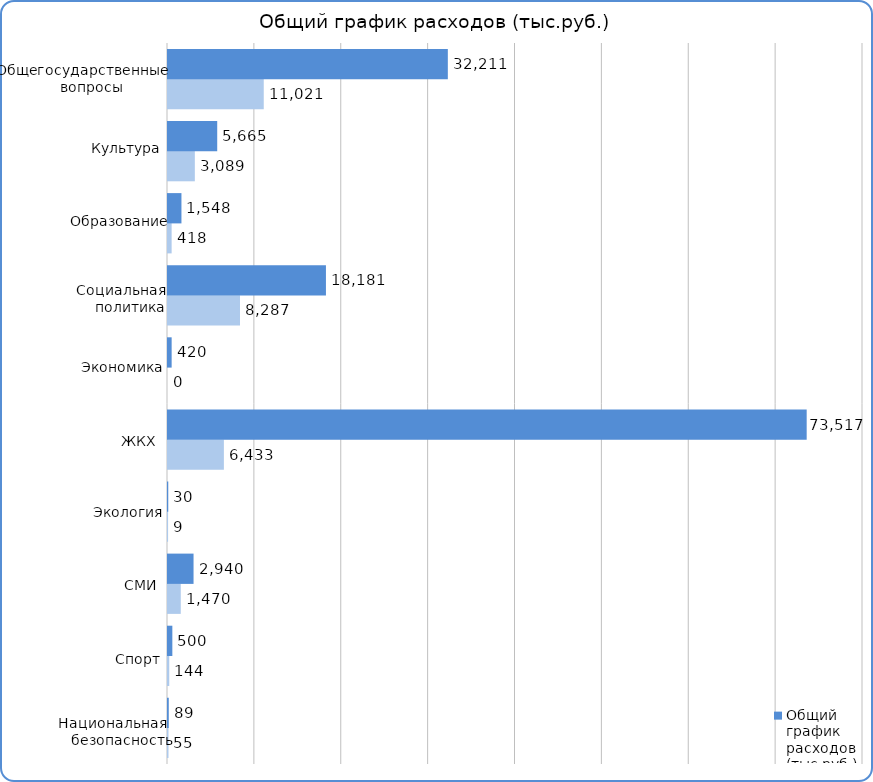
| Category | Факт | План  |
|---|---|---|
| Нац.безопасность | 54500 | 89300 |
| Спорт | 144100 | 500000 |
| СМИ | 1469500 | 2940000 |
| Экология | 8800 | 30000 |
| ЖКХ | 6432900 | 73517100 |
| Экономика | 0 | 420000 |
| Социальная политика | 8287000 | 18181000 |
| Образование | 418300 | 1548300 |
| Культура | 3089200 | 5664800 |
| Государственные вопросы | 11021300 | 32210900 |